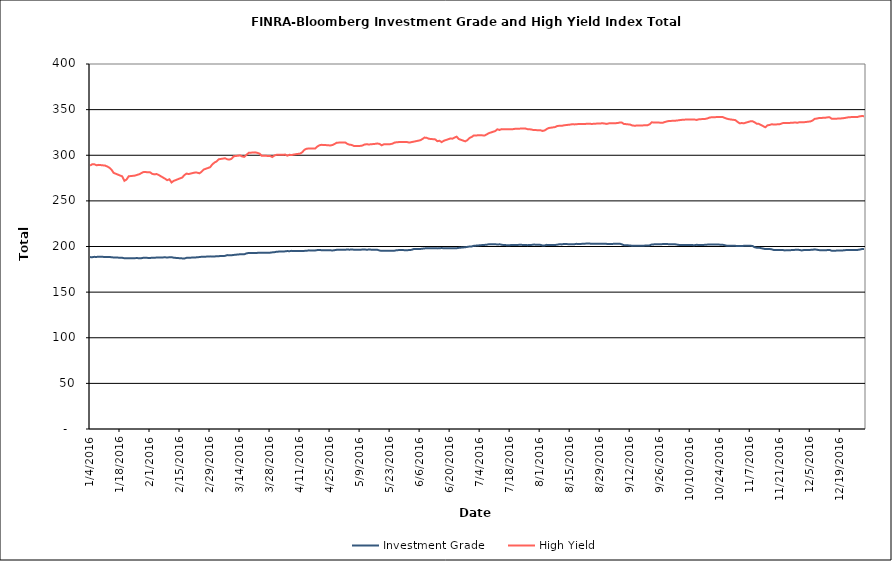
| Category | Investment Grade | High Yield |
|---|---|---|
| 1/4/16 | 188.381 | 288.66 |
| 1/5/16 | 188.267 | 290.104 |
| 1/6/16 | 188.652 | 290.134 |
| 1/7/16 | 188.566 | 288.992 |
| 1/8/16 | 188.818 | 289.452 |
| 1/11/16 | 188.546 | 288.696 |
| 1/12/16 | 188.571 | 287.678 |
| 1/13/16 | 188.602 | 286.344 |
| 1/14/16 | 188.152 | 284.133 |
| 1/15/16 | 188.039 | 280.669 |
| 1/19/16 | 187.614 | 276.856 |
| 1/20/16 | 187.117 | 271.948 |
| 1/21/16 | 187.26 | 273.375 |
| 1/22/16 | 187.182 | 276.914 |
| 1/25/16 | 187.235 | 277.728 |
| 1/26/16 | 187.33 | 278.532 |
| 1/27/16 | 187.065 | 279.194 |
| 1/28/16 | 187.241 | 280.568 |
| 1/29/16 | 187.696 | 281.653 |
| 2/1/16 | 187.417 | 281.298 |
| 2/2/16 | 187.72 | 279.608 |
| 2/3/16 | 187.721 | 279.031 |
| 2/4/16 | 187.855 | 279.454 |
| 2/5/16 | 187.886 | 278.382 |
| 2/8/16 | 188.148 | 274.268 |
| 2/9/16 | 187.944 | 272.672 |
| 2/10/16 | 188.182 | 273.675 |
| 2/11/16 | 188.283 | 270.177 |
| 2/12/16 | 187.702 | 271.91 |
| 2/16/16 | 186.961 | 275.607 |
| 2/17/16 | 186.847 | 278.251 |
| 2/18/16 | 187.58 | 279.907 |
| 2/19/16 | 187.713 | 279.41 |
| 2/22/16 | 187.953 | 281.109 |
| 2/23/16 | 188.213 | 280.94 |
| 2/24/16 | 188.406 | 280.202 |
| 2/25/16 | 188.768 | 281.875 |
| 2/26/16 | 188.719 | 284.35 |
| 2/29/16 | 189.189 | 286.89 |
| 3/1/16 | 188.954 | 289.916 |
| 3/2/16 | 188.963 | 291.934 |
| 3/3/16 | 189.401 | 293.172 |
| 3/4/16 | 189.416 | 295.577 |
| 3/7/16 | 189.744 | 296.71 |
| 3/8/16 | 190.57 | 295.553 |
| 3/9/16 | 190.293 | 295.25 |
| 3/10/16 | 190.409 | 296.174 |
| 3/11/16 | 190.761 | 298.865 |
| 3/14/16 | 191.479 | 299.801 |
| 3/15/16 | 191.537 | 298.659 |
| 3/16/16 | 191.56 | 298.253 |
| 3/17/16 | 192.446 | 300.505 |
| 3/18/16 | 192.907 | 302.641 |
| 3/21/16 | 192.959 | 303.17 |
| 3/22/16 | 192.997 | 302.638 |
| 3/23/16 | 193.28 | 301.871 |
| 3/24/16 | 193.171 | 299.546 |
| 3/28/16 | 193.245 | 299.154 |
| 3/29/16 | 193.563 | 298.043 |
| 3/30/16 | 193.762 | 299.745 |
| 3/31/16 | 194.254 | 300.469 |
| 4/1/16 | 194.406 | 300.46 |
| 4/4/16 | 194.67 | 300.708 |
| 4/5/16 | 195.008 | 299.556 |
| 4/6/16 | 194.822 | 300.513 |
| 4/7/16 | 195.213 | 300.205 |
| 4/8/16 | 195.153 | 300.789 |
| 4/11/16 | 195.181 | 301.833 |
| 4/12/16 | 194.982 | 303.31 |
| 4/13/16 | 195.197 | 306.047 |
| 4/14/16 | 195.274 | 307.187 |
| 4/15/16 | 195.76 | 307.333 |
| 4/18/16 | 195.669 | 307.314 |
| 4/19/16 | 196.069 | 309.527 |
| 4/20/16 | 196.195 | 310.94 |
| 4/21/16 | 195.95 | 311.395 |
| 4/22/16 | 195.948 | 311.313 |
| 4/25/16 | 195.881 | 310.737 |
| 4/26/16 | 195.632 | 311.167 |
| 4/27/16 | 195.917 | 312.26 |
| 4/28/16 | 196.362 | 313.686 |
| 4/29/16 | 196.549 | 313.857 |
| 5/2/16 | 196.446 | 314.055 |
| 5/3/16 | 196.722 | 312.471 |
| 5/4/16 | 196.517 | 311.595 |
| 5/5/16 | 196.718 | 311.311 |
| 5/6/16 | 196.537 | 310.262 |
| 5/9/16 | 196.503 | 310.255 |
| 5/10/16 | 196.613 | 310.626 |
| 5/11/16 | 196.745 | 311.706 |
| 5/12/16 | 196.466 | 312.093 |
| 5/13/16 | 196.627 | 311.779 |
| 5/16/16 | 196.451 | 312.491 |
| 5/17/16 | 196.435 | 312.857 |
| 5/18/16 | 195.613 | 312.462 |
| 5/19/16 | 195.235 | 310.91 |
| 5/20/16 | 195.273 | 311.95 |
| 5/23/16 | 195.358 | 312.157 |
| 5/24/16 | 195.211 | 312.655 |
| 5/25/16 | 195.406 | 313.839 |
| 5/26/16 | 195.925 | 314.239 |
| 5/27/16 | 196.054 | 314.412 |
| 5/31/16 | 196.003 | 314.392 |
| 6/1/16 | 196.05 | 313.86 |
| 6/2/16 | 196.396 | 314.467 |
| 6/3/16 | 197.238 | 314.891 |
| 6/6/16 | 197.301 | 316.41 |
| 6/7/16 | 197.59 | 317.7 |
| 6/8/16 | 197.878 | 319.363 |
| 6/9/16 | 198.134 | 319.164 |
| 6/10/16 | 198.171 | 318.061 |
| 6/13/16 | 198.215 | 317.394 |
| 6/14/16 | 197.929 | 315.404 |
| 6/15/16 | 198.124 | 315.892 |
| 6/16/16 | 198.28 | 314.379 |
| 6/17/16 | 198.13 | 315.848 |
| 6/20/16 | 198.048 | 318.301 |
| 6/21/16 | 197.996 | 318.18 |
| 6/22/16 | 198.15 | 319.311 |
| 6/23/16 | 198.125 | 320.382 |
| 6/24/16 | 198.506 | 317.802 |
| 6/27/16 | 199.206 | 315.236 |
| 6/28/16 | 199.586 | 316.453 |
| 6/29/16 | 200.002 | 318.908 |
| 6/30/16 | 200.063 | 319.994 |
| 7/1/16 | 200.739 | 321.77 |
| 7/5/16 | 201.589 | 321.792 |
| 7/6/16 | 201.737 | 321.541 |
| 7/7/16 | 201.963 | 322.797 |
| 7/8/16 | 202.451 | 324.195 |
| 7/11/16 | 202.567 | 326.491 |
| 7/12/16 | 202.068 | 328.452 |
| 7/13/16 | 202.405 | 327.718 |
| 7/14/16 | 201.959 | 328.632 |
| 7/15/16 | 201.512 | 328.373 |
| 7/18/16 | 201.486 | 328.459 |
| 7/19/16 | 201.691 | 328.488 |
| 7/20/16 | 201.545 | 328.895 |
| 7/21/16 | 201.662 | 329.173 |
| 7/22/16 | 201.804 | 329.137 |
| 7/25/16 | 201.753 | 329.349 |
| 7/26/16 | 201.457 | 328.617 |
| 7/27/16 | 201.668 | 328.516 |
| 7/28/16 | 201.757 | 328.132 |
| 7/29/16 | 202.092 | 327.564 |
| 8/1/16 | 201.836 | 327.49 |
| 8/2/16 | 201.18 | 326.651 |
| 8/3/16 | 201.131 | 327.122 |
| 8/4/16 | 201.822 | 328.693 |
| 8/5/16 | 201.538 | 329.878 |
| 8/8/16 | 201.659 | 330.89 |
| 8/9/16 | 202.023 | 332.085 |
| 8/10/16 | 202.581 | 332.279 |
| 8/11/16 | 202.292 | 332.233 |
| 8/12/16 | 202.742 | 332.807 |
| 8/15/16 | 202.494 | 333.604 |
| 8/16/16 | 202.509 | 334.019 |
| 8/17/16 | 202.553 | 333.806 |
| 8/18/16 | 202.914 | 333.971 |
| 8/19/16 | 202.692 | 334.315 |
| 8/22/16 | 203.125 | 334.283 |
| 8/23/16 | 203.296 | 334.651 |
| 8/24/16 | 203.222 | 334.604 |
| 8/25/16 | 202.969 | 334.231 |
| 8/26/16 | 202.916 | 334.548 |
| 8/29/16 | 203.037 | 334.842 |
| 8/30/16 | 203.139 | 335.049 |
| 8/31/16 | 203.059 | 334.78 |
| 9/1/16 | 202.871 | 334.34 |
| 9/2/16 | 202.722 | 334.945 |
| 9/6/16 | 203.041 | 335.237 |
| 9/7/16 | 203.141 | 335.819 |
| 9/8/16 | 202.44 | 335.868 |
| 9/9/16 | 201.432 | 334.347 |
| 9/12/16 | 201.154 | 333.589 |
| 9/13/16 | 200.682 | 332.561 |
| 9/14/16 | 200.787 | 332.394 |
| 9/15/16 | 200.692 | 332.511 |
| 9/16/16 | 200.887 | 332.517 |
| 9/19/16 | 200.964 | 332.846 |
| 9/20/16 | 201.207 | 332.872 |
| 9/21/16 | 201.226 | 333.856 |
| 9/22/16 | 202.184 | 336.064 |
| 9/23/16 | 202.326 | 335.949 |
| 9/26/16 | 202.455 | 335.719 |
| 9/27/16 | 202.606 | 335.487 |
| 9/28/16 | 202.756 | 336.34 |
| 9/29/16 | 202.701 | 337.009 |
| 9/30/16 | 202.541 | 337.519 |
| 10/3/16 | 202.4 | 337.882 |
| 10/4/16 | 202.001 | 338.121 |
| 10/5/16 | 201.601 | 338.475 |
| 10/6/16 | 201.602 | 338.772 |
| 10/7/16 | 201.662 | 338.989 |
| 10/10/16 | 201.736 | 339.286 |
| 10/11/16 | 201.522 | 339.134 |
| 10/12/16 | 201.442 | 339.132 |
| 10/13/16 | 201.856 | 338.688 |
| 10/14/16 | 201.618 | 339.419 |
| 10/17/16 | 201.809 | 339.829 |
| 10/18/16 | 202.078 | 340.389 |
| 10/19/16 | 202.272 | 341.285 |
| 10/20/16 | 202.311 | 341.63 |
| 10/21/16 | 202.223 | 341.668 |
| 10/24/16 | 202.029 | 342.053 |
| 10/25/16 | 201.952 | 341.971 |
| 10/26/16 | 201.472 | 340.997 |
| 10/27/16 | 200.834 | 340.116 |
| 10/28/16 | 200.697 | 339.489 |
| 10/31/16 | 200.748 | 338.526 |
| 11/1/16 | 200.44 | 336.691 |
| 11/2/16 | 200.618 | 334.99 |
| 11/3/16 | 200.52 | 335.281 |
| 11/4/16 | 200.739 | 335.071 |
| 11/7/16 | 200.781 | 337.16 |
| 11/8/16 | 200.576 | 337.354 |
| 11/9/16 | 199.257 | 336.143 |
| 11/10/16 | 198.676 | 334.522 |
| 11/11/16 | 198.706 | 334.383 |
| 11/14/16 | 197.184 | 330.657 |
| 11/15/16 | 197.322 | 332.754 |
| 11/16/16 | 197.312 | 333.201 |
| 11/17/16 | 196.871 | 333.991 |
| 11/18/16 | 196.159 | 333.597 |
| 11/21/16 | 196.094 | 334.144 |
| 11/22/16 | 196.3 | 335.182 |
| 11/23/16 | 195.73 | 335.333 |
| 11/25/16 | 195.865 | 335.383 |
| 11/28/16 | 196.339 | 335.883 |
| 11/29/16 | 196.462 | 335.624 |
| 11/30/16 | 196.205 | 336.247 |
| 12/1/16 | 195.627 | 336.019 |
| 12/2/16 | 196.182 | 336.18 |
| 12/5/16 | 196.294 | 337.066 |
| 12/6/16 | 196.339 | 337.959 |
| 12/7/16 | 196.841 | 339.867 |
| 12/8/16 | 196.496 | 340.184 |
| 12/9/16 | 196.035 | 340.76 |
| 12/12/16 | 195.858 | 341.127 |
| 12/13/16 | 196.093 | 341.508 |
| 12/14/16 | 196.245 | 341.608 |
| 12/15/16 | 195.299 | 339.941 |
| 12/16/16 | 195.344 | 339.965 |
| 12/19/16 | 195.733 | 340.285 |
| 12/20/16 | 195.642 | 340.54 |
| 12/21/16 | 196.013 | 340.808 |
| 12/22/16 | 196.046 | 341.289 |
| 12/23/16 | 196.227 | 341.732 |
| 12/27/16 | 196.231 | 341.945 |
| 12/28/16 | 196.591 | 342.601 |
| 12/29/16 | 197.164 | 342.93 |
| 12/30/16 | 197.407 | 342.84 |